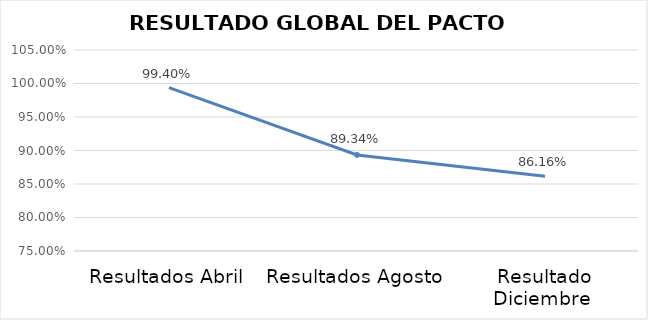
| Category | RESULTADO GLOBAL DEL PACTO |
|---|---|
| Resultados Abril | 0.994 |
| Resultados Agosto | 0.893 |
| Resultado Diciembre  | 0.862 |